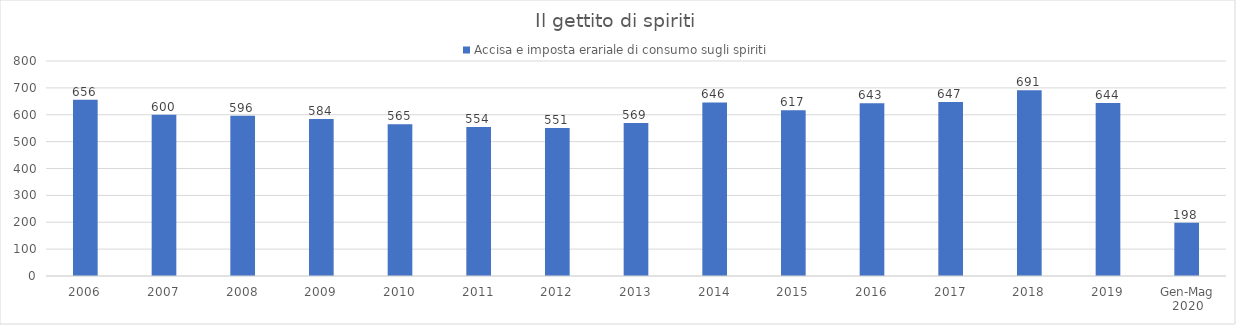
| Category | Accisa e imposta erariale di consumo sugli spiriti |
|---|---|
| 2006 | 656 |
| 2007 | 600 |
| 2008 | 596 |
| 2009 | 584 |
| 2010 | 565 |
| 2011 | 554 |
| 2012 | 551 |
| 2013 | 569 |
| 2014 | 646 |
| 2015 | 617 |
| 2016 | 643 |
| 2017 | 647 |
| 2018 | 691 |
| 2019 | 644 |
| Gen-Mag 2020 | 198 |